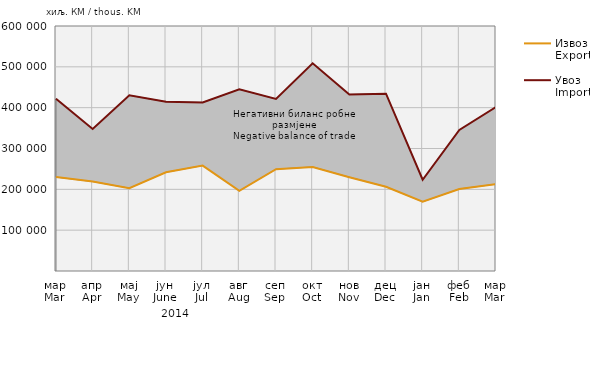
| Category | Извоз
Export | Увоз
Import |
|---|---|---|
| мар
Mar | 229938 | 422057 |
| апр
Apr | 218972 | 347841 |
| мај
May | 202886 | 430360 |
| јун
June | 241773 | 414297 |
| јул
Jul | 258199 | 412801 |
| авг
Aug | 196460 | 444841 |
| сеп
Sep | 249428 | 421218 |
| окт
Oct | 254890 | 508654 |
| нов
Nov | 229750 | 432236 |
| дец
Dec | 206445 | 434262 |
| јан
Jan | 169534 | 223470 |
| феб
Feb | 200956 | 345422 |
| мар
Mar | 212656 | 401757 |